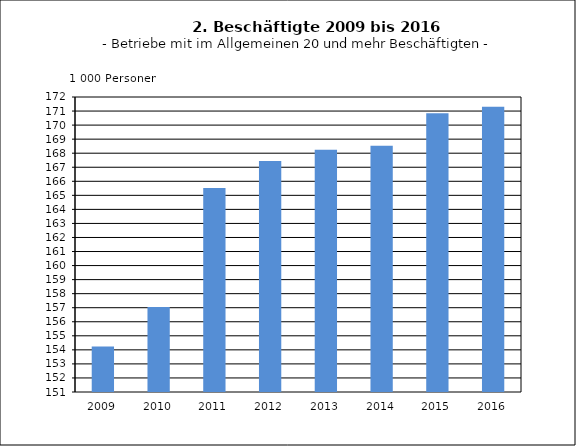
| Category | Beschäftigte |
|---|---|
| 2009.0 | 154.243 |
| 2010.0 | 157.043 |
| 2011.0 | 165.528 |
| 2012.0 | 167.446 |
| 2013.0 | 168.246 |
| 2014.0 | 168.527 |
| 2015.0 | 170.836 |
| 2016.0 | 171.305 |